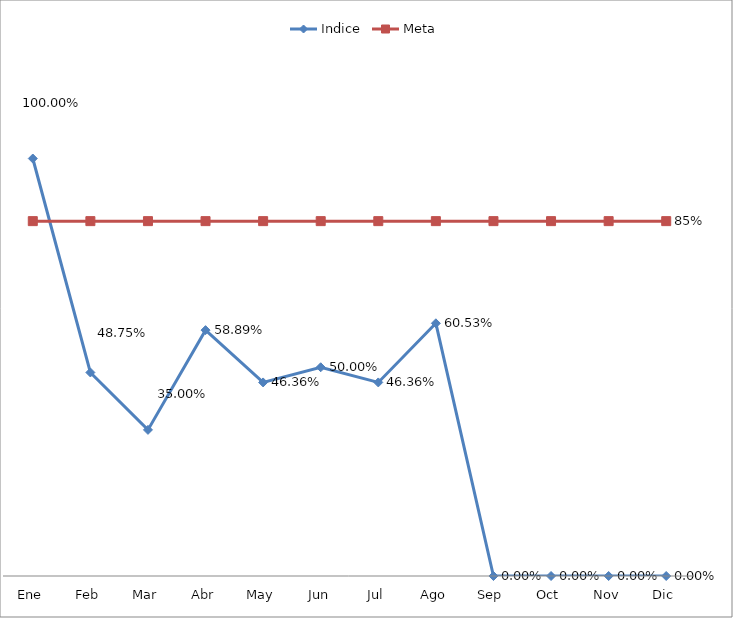
| Category | Indice | Meta |
|---|---|---|
| Ene | 1 | 0.85 |
| Feb | 0.488 | 0.85 |
| Mar | 0.35 | 0.85 |
| Abr | 0.589 | 0.85 |
| May | 0.464 | 0.85 |
| Jun | 0.5 | 0.85 |
| Jul | 0.464 | 0.85 |
| Ago | 0.605 | 0.85 |
| Sep | 0 | 0.85 |
| Oct | 0 | 0.85 |
| Nov | 0 | 0.85 |
| Dic | 0 | 0.85 |